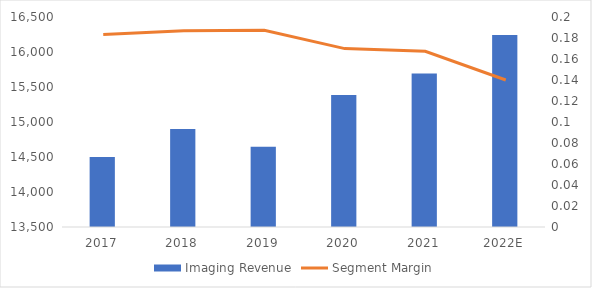
| Category | Imaging Revenue |
|---|---|
| 2017 | 14500 |
| 2018 | 14900 |
| 2019 | 14648 |
| 2020 | 15387 |
| 2021 | 15694 |
| 2022E | 16243.29 |